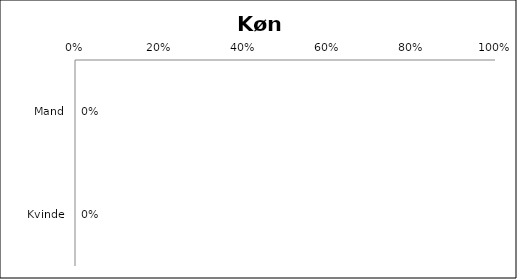
| Category | Køn (Udfylder) |
|---|---|
| Mand | 0 |
| Kvinde | 0 |